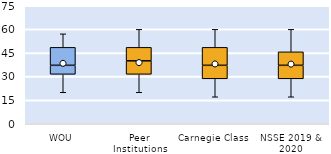
| Category | 25th | 50th | 75th |
|---|---|---|---|
| WOU | 31.429 | 5.714 | 11.429 |
| Peer Institutions | 31.429 | 8.571 | 8.571 |
| Carnegie Class | 28.571 | 8.571 | 11.429 |
| NSSE 2019 & 2020 | 28.571 | 8.571 | 8.571 |